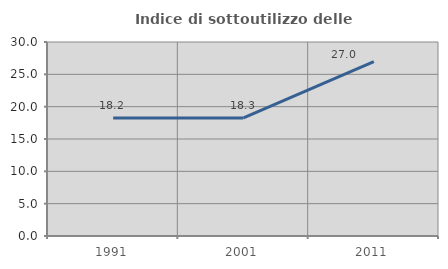
| Category | Indice di sottoutilizzo delle abitazioni  |
|---|---|
| 1991.0 | 18.232 |
| 2001.0 | 18.261 |
| 2011.0 | 26.952 |